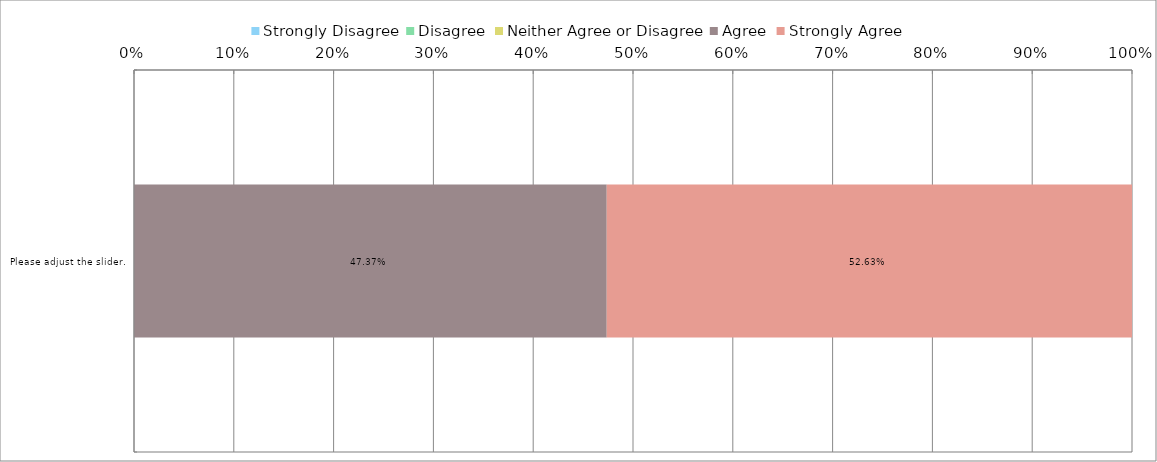
| Category | Strongly Disagree | Disagree | Neither Agree or Disagree | Agree | Strongly Agree |
|---|---|---|---|---|---|
| 0 | 0 | 0 | 0 | 0.474 | 0.526 |